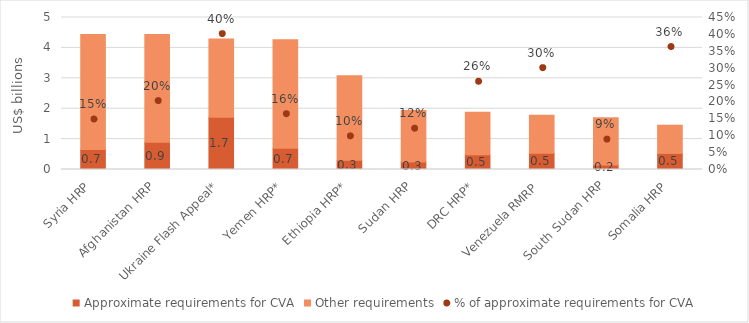
| Category | Approximate requirements for CVA | Other requirements |
|---|---|---|
| Syria HRP | 0.658 | 3.786 |
| Afghanistan HRP | 0.9 | 3.542 |
| Ukraine Flash Appeal* | 1.72 | 2.572 |
| Yemen HRP* | 0.699 | 3.573 |
| Ethiopia HRP* | 0.303 | 2.782 |
| Sudan HRP | 0.251 | 1.686 |
| DRC HRP* | 0.489 | 1.393 |
| Venezuela RMRP | 0.536 | 1.25 |
| South Sudan HRP | 0.15 | 1.549 |
| Somalia HRP | 0.529 | 0.929 |